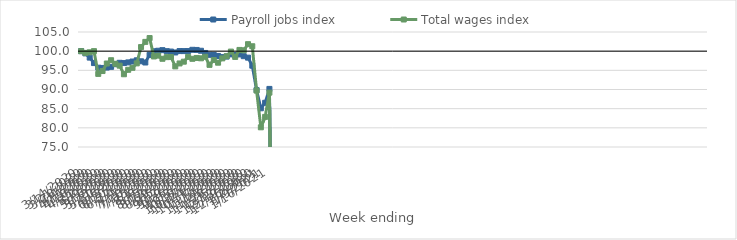
| Category | Payroll jobs index | Total wages index |
|---|---|---|
| 14/03/2020 | 100 | 100 |
| 21/03/2020 | 99.427 | 99.546 |
| 28/03/2020 | 98.319 | 99.704 |
| 04/04/2020 | 96.896 | 100.009 |
| 11/04/2020 | 95.691 | 94.071 |
| 18/04/2020 | 95.623 | 94.816 |
| 25/04/2020 | 95.719 | 96.779 |
| 02/05/2020 | 95.906 | 97.638 |
| 09/05/2020 | 96.596 | 96.706 |
| 16/05/2020 | 96.966 | 96.217 |
| 23/05/2020 | 96.899 | 93.978 |
| 30/05/2020 | 97.07 | 95.14 |
| 06/06/2020 | 97.299 | 95.661 |
| 13/06/2020 | 97.617 | 96.819 |
| 20/06/2020 | 97.358 | 101.07 |
| 27/06/2020 | 97.043 | 102.424 |
| 04/07/2020 | 99.029 | 103.419 |
| 11/07/2020 | 99.977 | 98.618 |
| 18/07/2020 | 100.109 | 98.835 |
| 25/07/2020 | 100.263 | 98.014 |
| 01/08/2020 | 100.001 | 98.443 |
| 08/08/2020 | 99.897 | 98.47 |
| 15/08/2020 | 99.661 | 96.034 |
| 22/08/2020 | 100.026 | 96.795 |
| 29/08/2020 | 100.017 | 97.257 |
| 05/09/2020 | 100.027 | 98.503 |
| 12/09/2020 | 100.357 | 98.009 |
| 19/09/2020 | 100.317 | 98.227 |
| 26/09/2020 | 100.105 | 98.14 |
| 03/10/2020 | 99.531 | 98.533 |
| 10/10/2020 | 99.038 | 96.429 |
| 17/10/2020 | 98.994 | 97.678 |
| 24/10/2020 | 98.747 | 96.994 |
| 31/10/2020 | 98.447 | 98.118 |
| 07/11/2020 | 98.589 | 98.686 |
| 14/11/2020 | 99.156 | 99.891 |
| 21/11/2020 | 98.996 | 98.502 |
| 28/11/2020 | 99.147 | 100.322 |
| 05/12/2020 | 98.692 | 100.229 |
| 12/12/2020 | 98.311 | 101.826 |
| 19/12/2020 | 96.209 | 101.284 |
| 26/12/2020 | 89.854 | 89.719 |
| 02/01/2021 | 85.103 | 80.137 |
| 09/01/2021 | 86.532 | 82.856 |
| 16/01/2021 | 90.152 | 89.178 |